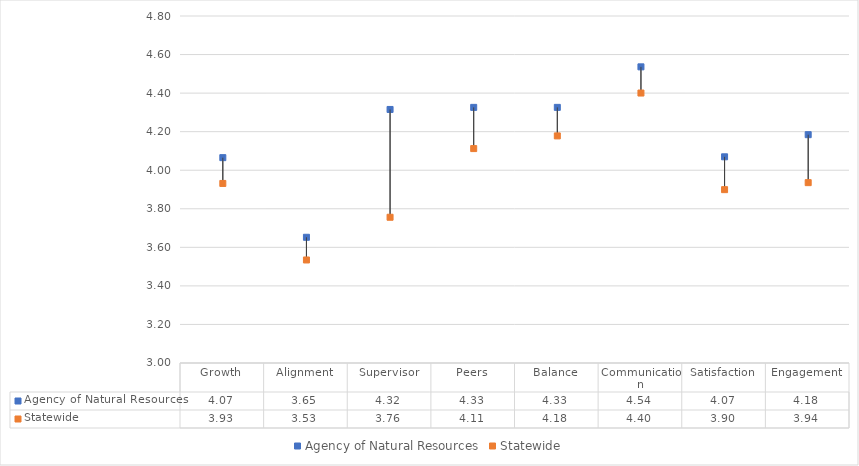
| Category | Agency of Natural Resources | Statewide |
|---|---|---|
| Growth | 4.065 | 3.931 |
| Alignment | 3.652 | 3.534 |
| Supervisor | 4.315 | 3.756 |
| Peers | 4.326 | 4.112 |
| Balance | 4.326 | 4.178 |
| Communication | 4.536 | 4.4 |
| Satisfaction | 4.07 | 3.899 |
| Engagement | 4.184 | 3.936 |